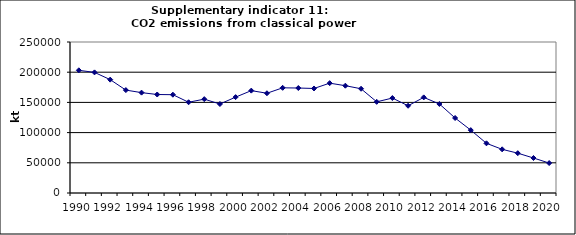
| Category | CO2 emissions from classical power production, kt |
|---|---|
| 1990 | 203113.673 |
| 1991 | 199708.677 |
| 1992 | 187695.656 |
| 1993 | 170351.008 |
| 1994 | 166167.942 |
| 1995 | 163068.529 |
| 1996 | 162745.973 |
| 1997 | 150256.311 |
| 1998 | 155376.504 |
| 1999 | 147339.007 |
| 2000 | 158728.52 |
| 2001 | 169481.562 |
| 2002 | 165157.718 |
| 2003 | 174129.025 |
| 2004 | 173809.141 |
| 2005 | 173062.051 |
| 2006 | 181847.14 |
| 2007 | 177659.55 |
| 2008 | 172595.414 |
| 2009 | 150937.129 |
| 2010 | 157189.523 |
| 2011 | 144444.768 |
| 2012 | 158294.618 |
| 2013 | 147353.04 |
| 2014 | 124195.825 |
| 2015 | 104083.767 |
| 2016 | 82282.004 |
| 2017 | 72299.103 |
| 2018 | 65917.365 |
| 2019 | 57930.451 |
| 2020 | 49578.065 |